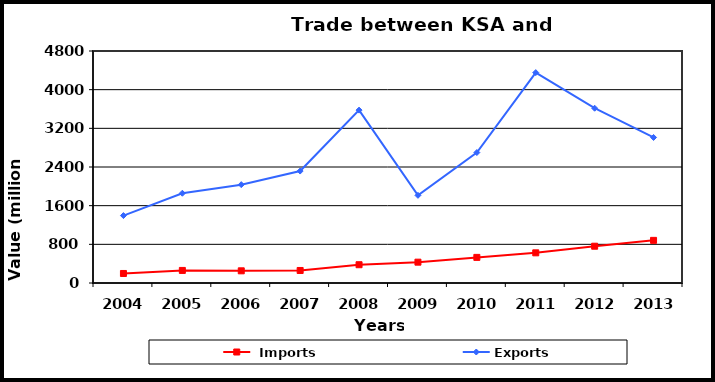
| Category |  Imports | Exports |
|---|---|---|
| 2004.0 | 197 | 1395 |
| 2005.0 | 260 | 1857 |
| 2006.0 | 252 | 2035 |
| 2007.0 | 259 | 2316 |
| 2008.0 | 378 | 3577 |
| 2009.0 | 431 | 1814 |
| 2010.0 | 530 | 2699 |
| 2011.0 | 624 | 4353 |
| 2012.0 | 761 | 3616 |
| 2013.0 | 882 | 3011 |